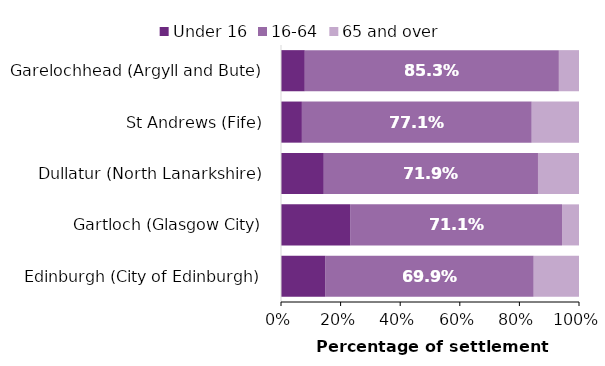
| Category | Under 16 | 16-64 | 65 and over |
|---|---|---|---|
| Edinburgh (City of Edinburgh) | 0.148 | 0.699 | 0.153 |
| Gartloch (Glasgow City) | 0.232 | 0.711 | 0.057 |
| Dullatur (North Lanarkshire) | 0.143 | 0.719 | 0.138 |
| St Andrews (Fife) | 0.07 | 0.771 | 0.159 |
| Garelochhead (Argyll and Bute) | 0.08 | 0.853 | 0.068 |